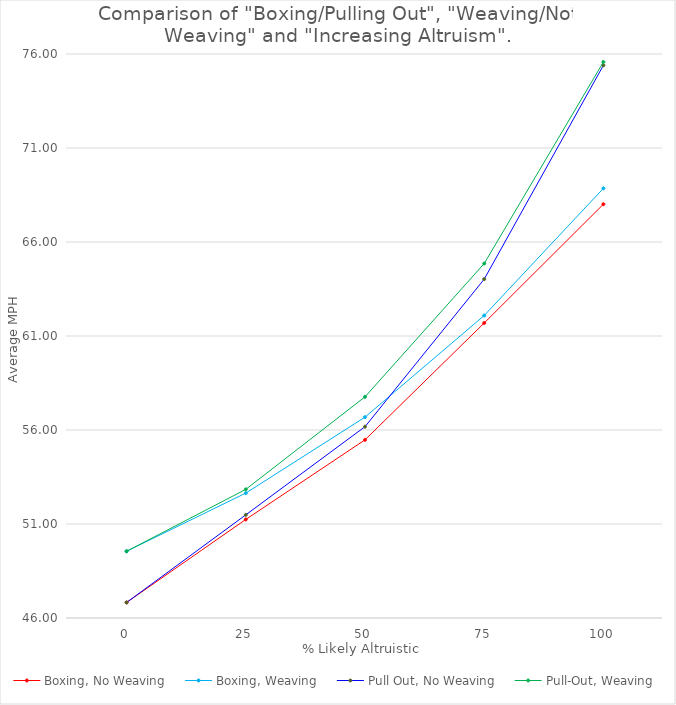
| Category | Boxing, No Weaving | Boxing, Weaving | Pull Out, No Weaving | Pull-Out, Weaving |
|---|---|---|---|---|
| 0.0 | 46.827 | 49.55 | 46.827 | 49.55 |
| 25.0 | 51.243 | 52.643 | 51.487 | 52.843 |
| 50.0 | 55.477 | 56.683 | 56.177 | 57.763 |
| 75.0 | 61.69 | 62.09 | 64.023 | 64.853 |
| 100.0 | 68.01 | 68.853 | 75.397 | 75.577 |